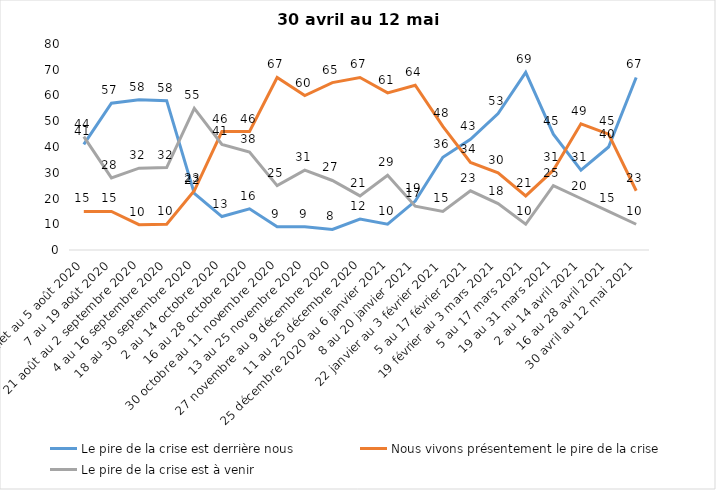
| Category | Le pire de la crise est derrière nous | Nous vivons présentement le pire de la crise | Le pire de la crise est à venir |
|---|---|---|---|
| 24 juillet au 5 août 2020 | 41 | 15 | 44 |
| 7 au 19 août 2020 | 57 | 15 | 28 |
| 21 août au 2 septembre 2020 | 58.39 | 9.84 | 31.77 |
| 4 au 16 septembre 2020 | 58 | 10 | 32 |
| 18 au 30 septembre 2020 | 22 | 23 | 55 |
| 2 au 14 octobre 2020 | 13 | 46 | 41 |
| 16 au 28 octobre 2020 | 16 | 46 | 38 |
| 30 octobre au 11 novembre 2020 | 9 | 67 | 25 |
| 13 au 25 novembre 2020 | 9 | 60 | 31 |
| 27 novembre au 9 décembre 2020 | 8 | 65 | 27 |
| 11 au 25 décembre 2020 | 12 | 67 | 21 |
| 25 décembre 2020 au 6 janvier 2021 | 10 | 61 | 29 |
| 8 au 20 janvier 2021 | 19 | 64 | 17 |
| 22 janvier au 3 février 2021 | 36 | 48 | 15 |
| 5 au 17 février 2021 | 43 | 34 | 23 |
| 19 février au 3 mars 2021 | 53 | 30 | 18 |
| 5 au 17 mars 2021 | 69 | 21 | 10 |
| 19 au 31 mars 2021 | 45 | 31 | 25 |
| 2 au 14 avril 2021 | 31 | 49 | 20 |
| 16 au 28 avril 2021 | 40 | 45 | 15 |
| 30 avril au 12 mai 2021 | 67 | 23 | 10 |